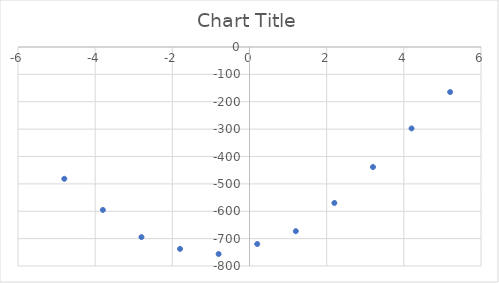
| Category | Series 0 |
|---|---|
| 5.2 | -164.591 |
| 4.2 | -297.504 |
| 3.2 | -438.518 |
| 2.2 | -569.737 |
| 1.2 | -672.803 |
| 0.2 | -719.652 |
| -0.8 | -756.134 |
| -1.8 | -737.453 |
| -2.8 | -694.489 |
| -3.8 | -595.165 |
| -4.8 | -481.373 |